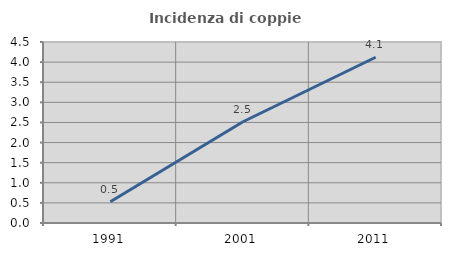
| Category | Incidenza di coppie miste |
|---|---|
| 1991.0 | 0.528 |
| 2001.0 | 2.517 |
| 2011.0 | 4.121 |